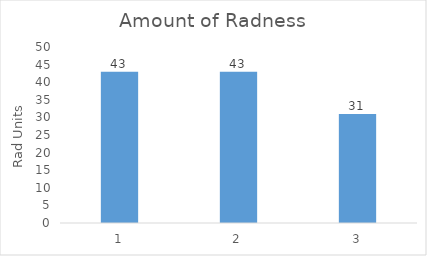
| Category | Amount of Radness |
|---|---|
| 0 | 43 |
| 1 | 43 |
| 2 | 31 |